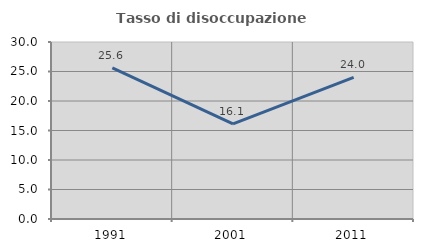
| Category | Tasso di disoccupazione giovanile  |
|---|---|
| 1991.0 | 25.6 |
| 2001.0 | 16.129 |
| 2011.0 | 24 |